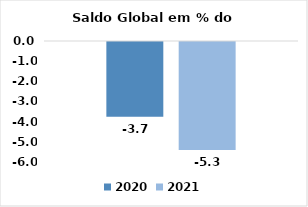
| Category | 2020 | 2021 |
|---|---|---|
|  | -3.705 | -5.35 |